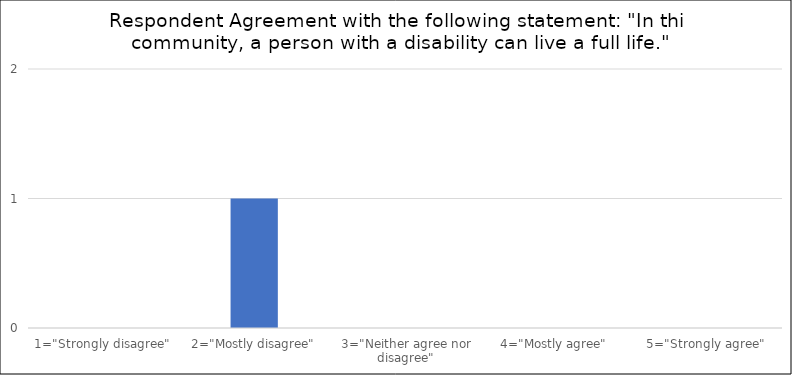
| Category | Number of Responses |
|---|---|
| 1="Strongly disagree" | 0 |
| 2="Mostly disagree" | 1 |
| 3="Neither agree nor disagree" | 0 |
| 4="Mostly agree" | 0 |
| 5="Strongly agree" | 0 |